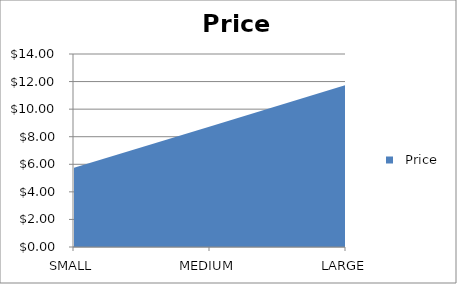
| Category |   Price |
|---|---|
| SMALL | 5.75 |
| MEDIUM | 8.75 |
| LARGE | 11.75 |